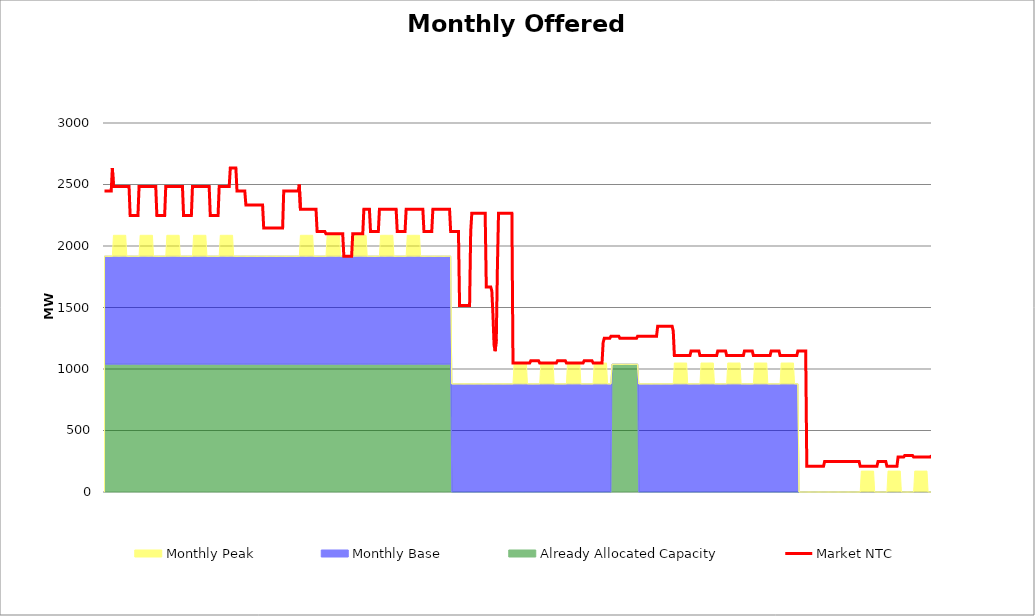
| Category | Market NTC |
|---|---|
| 0 | 2447 |
| 1 | 2447 |
| 2 | 2447 |
| 3 | 2447 |
| 4 | 2447 |
| 5 | 2447 |
| 6 | 2447 |
| 7 | 2634 |
| 8 | 2484 |
| 9 | 2484 |
| 10 | 2484 |
| 11 | 2484 |
| 12 | 2484 |
| 13 | 2484 |
| 14 | 2484 |
| 15 | 2484 |
| 16 | 2484 |
| 17 | 2484 |
| 18 | 2484 |
| 19 | 2484 |
| 20 | 2484 |
| 21 | 2484 |
| 22 | 2484 |
| 23 | 2247 |
| 24 | 2247 |
| 25 | 2247 |
| 26 | 2247 |
| 27 | 2247 |
| 28 | 2247 |
| 29 | 2247 |
| 30 | 2247 |
| 31 | 2484 |
| 32 | 2484 |
| 33 | 2484 |
| 34 | 2484 |
| 35 | 2484 |
| 36 | 2484 |
| 37 | 2484 |
| 38 | 2484 |
| 39 | 2484 |
| 40 | 2484 |
| 41 | 2484 |
| 42 | 2484 |
| 43 | 2484 |
| 44 | 2484 |
| 45 | 2484 |
| 46 | 2484 |
| 47 | 2247 |
| 48 | 2247 |
| 49 | 2247 |
| 50 | 2247 |
| 51 | 2247 |
| 52 | 2247 |
| 53 | 2247 |
| 54 | 2247 |
| 55 | 2484 |
| 56 | 2484 |
| 57 | 2484 |
| 58 | 2484 |
| 59 | 2484 |
| 60 | 2484 |
| 61 | 2484 |
| 62 | 2484 |
| 63 | 2484 |
| 64 | 2484 |
| 65 | 2484 |
| 66 | 2484 |
| 67 | 2484 |
| 68 | 2484 |
| 69 | 2484 |
| 70 | 2484 |
| 71 | 2247 |
| 72 | 2247 |
| 73 | 2247 |
| 74 | 2247 |
| 75 | 2247 |
| 76 | 2247 |
| 77 | 2247 |
| 78 | 2247 |
| 79 | 2484 |
| 80 | 2484 |
| 81 | 2484 |
| 82 | 2484 |
| 83 | 2484 |
| 84 | 2484 |
| 85 | 2484 |
| 86 | 2484 |
| 87 | 2484 |
| 88 | 2484 |
| 89 | 2484 |
| 90 | 2484 |
| 91 | 2484 |
| 92 | 2484 |
| 93 | 2484 |
| 94 | 2484 |
| 95 | 2247 |
| 96 | 2247 |
| 97 | 2247 |
| 98 | 2247 |
| 99 | 2247 |
| 100 | 2247 |
| 101 | 2247 |
| 102 | 2247 |
| 103 | 2484 |
| 104 | 2484 |
| 105 | 2484 |
| 106 | 2484 |
| 107 | 2484 |
| 108 | 2484 |
| 109 | 2484 |
| 110 | 2484 |
| 111 | 2484 |
| 112 | 2484 |
| 113 | 2634 |
| 114 | 2634 |
| 115 | 2634 |
| 116 | 2634 |
| 117 | 2634 |
| 118 | 2634 |
| 119 | 2447 |
| 120 | 2447 |
| 121 | 2447 |
| 122 | 2447 |
| 123 | 2447 |
| 124 | 2447 |
| 125 | 2447 |
| 126 | 2447 |
| 127 | 2334 |
| 128 | 2334 |
| 129 | 2334 |
| 130 | 2334 |
| 131 | 2334 |
| 132 | 2334 |
| 133 | 2334 |
| 134 | 2334 |
| 135 | 2334 |
| 136 | 2334 |
| 137 | 2334 |
| 138 | 2334 |
| 139 | 2334 |
| 140 | 2334 |
| 141 | 2334 |
| 142 | 2334 |
| 143 | 2147 |
| 144 | 2147 |
| 145 | 2147 |
| 146 | 2147 |
| 147 | 2147 |
| 148 | 2147 |
| 149 | 2147 |
| 150 | 2147 |
| 151 | 2147 |
| 152 | 2147 |
| 153 | 2147 |
| 154 | 2147 |
| 155 | 2147 |
| 156 | 2147 |
| 157 | 2147 |
| 158 | 2147 |
| 159 | 2147 |
| 160 | 2147 |
| 161 | 2447 |
| 162 | 2447 |
| 163 | 2447 |
| 164 | 2447 |
| 165 | 2447 |
| 166 | 2447 |
| 167 | 2447 |
| 168 | 2447 |
| 169 | 2447 |
| 170 | 2447 |
| 171 | 2447 |
| 172 | 2447 |
| 173 | 2447 |
| 174 | 2447 |
| 175 | 2499 |
| 176 | 2299 |
| 177 | 2299 |
| 178 | 2299 |
| 179 | 2299 |
| 180 | 2299 |
| 181 | 2299 |
| 182 | 2299 |
| 183 | 2299 |
| 184 | 2299 |
| 185 | 2299 |
| 186 | 2299 |
| 187 | 2299 |
| 188 | 2299 |
| 189 | 2299 |
| 190 | 2299 |
| 191 | 2117 |
| 192 | 2117 |
| 193 | 2117 |
| 194 | 2117 |
| 195 | 2117 |
| 196 | 2117 |
| 197 | 2117 |
| 198 | 2117 |
| 199 | 2099 |
| 200 | 2099 |
| 201 | 2099 |
| 202 | 2099 |
| 203 | 2099 |
| 204 | 2099 |
| 205 | 2099 |
| 206 | 2099 |
| 207 | 2099 |
| 208 | 2099 |
| 209 | 2099 |
| 210 | 2099 |
| 211 | 2099 |
| 212 | 2099 |
| 213 | 2099 |
| 214 | 2099 |
| 215 | 1917 |
| 216 | 1917 |
| 217 | 1917 |
| 218 | 1917 |
| 219 | 1917 |
| 220 | 1917 |
| 221 | 1917 |
| 222 | 1917 |
| 223 | 2099 |
| 224 | 2099 |
| 225 | 2099 |
| 226 | 2099 |
| 227 | 2099 |
| 228 | 2099 |
| 229 | 2099 |
| 230 | 2099 |
| 231 | 2099 |
| 232 | 2099 |
| 233 | 2299 |
| 234 | 2299 |
| 235 | 2299 |
| 236 | 2299 |
| 237 | 2299 |
| 238 | 2299 |
| 239 | 2117 |
| 240 | 2117 |
| 241 | 2117 |
| 242 | 2117 |
| 243 | 2117 |
| 244 | 2117 |
| 245 | 2117 |
| 246 | 2117 |
| 247 | 2299 |
| 248 | 2299 |
| 249 | 2299 |
| 250 | 2299 |
| 251 | 2299 |
| 252 | 2299 |
| 253 | 2299 |
| 254 | 2299 |
| 255 | 2299 |
| 256 | 2299 |
| 257 | 2299 |
| 258 | 2299 |
| 259 | 2299 |
| 260 | 2299 |
| 261 | 2299 |
| 262 | 2299 |
| 263 | 2117 |
| 264 | 2117 |
| 265 | 2117 |
| 266 | 2117 |
| 267 | 2117 |
| 268 | 2117 |
| 269 | 2117 |
| 270 | 2117 |
| 271 | 2299 |
| 272 | 2299 |
| 273 | 2299 |
| 274 | 2299 |
| 275 | 2299 |
| 276 | 2299 |
| 277 | 2299 |
| 278 | 2299 |
| 279 | 2299 |
| 280 | 2299 |
| 281 | 2299 |
| 282 | 2299 |
| 283 | 2299 |
| 284 | 2299 |
| 285 | 2299 |
| 286 | 2299 |
| 287 | 2117 |
| 288 | 2117 |
| 289 | 2117 |
| 290 | 2117 |
| 291 | 2117 |
| 292 | 2117 |
| 293 | 2117 |
| 294 | 2117 |
| 295 | 2299 |
| 296 | 2299 |
| 297 | 2299 |
| 298 | 2299 |
| 299 | 2299 |
| 300 | 2299 |
| 301 | 2299 |
| 302 | 2299 |
| 303 | 2299 |
| 304 | 2299 |
| 305 | 2299 |
| 306 | 2299 |
| 307 | 2299 |
| 308 | 2299 |
| 309 | 2299 |
| 310 | 2299 |
| 311 | 2117 |
| 312 | 2117 |
| 313 | 2117 |
| 314 | 2117 |
| 315 | 2117 |
| 316 | 2117 |
| 317 | 2117 |
| 318 | 2117 |
| 319 | 1517 |
| 320 | 1517 |
| 321 | 1517 |
| 322 | 1517 |
| 323 | 1517 |
| 324 | 1517 |
| 325 | 1517 |
| 326 | 1517 |
| 327 | 1517 |
| 328 | 1517 |
| 329 | 2117 |
| 330 | 2267 |
| 331 | 2267 |
| 332 | 2267 |
| 333 | 2267 |
| 334 | 2267 |
| 335 | 2267 |
| 336 | 2267 |
| 337 | 2267 |
| 338 | 2267 |
| 339 | 2267 |
| 340 | 2267 |
| 341 | 2267 |
| 342 | 2267 |
| 343 | 1667 |
| 344 | 1667 |
| 345 | 1667 |
| 346 | 1667 |
| 347 | 1667 |
| 348 | 1634 |
| 349 | 1438 |
| 350 | 1194 |
| 351 | 1145 |
| 352 | 1243 |
| 353 | 1829 |
| 354 | 2267 |
| 355 | 2267 |
| 356 | 2267 |
| 357 | 2267 |
| 358 | 2267 |
| 359 | 2267 |
| 360 | 2267 |
| 361 | 2267 |
| 362 | 2267 |
| 363 | 2267 |
| 364 | 2267 |
| 365 | 2267 |
| 366 | 2267 |
| 367 | 1049 |
| 368 | 1049 |
| 369 | 1049 |
| 370 | 1049 |
| 371 | 1049 |
| 372 | 1049 |
| 373 | 1049 |
| 374 | 1049 |
| 375 | 1049 |
| 376 | 1049 |
| 377 | 1049 |
| 378 | 1049 |
| 379 | 1049 |
| 380 | 1049 |
| 381 | 1049 |
| 382 | 1049 |
| 383 | 1067 |
| 384 | 1067 |
| 385 | 1067 |
| 386 | 1067 |
| 387 | 1067 |
| 388 | 1067 |
| 389 | 1067 |
| 390 | 1067 |
| 391 | 1049 |
| 392 | 1049 |
| 393 | 1049 |
| 394 | 1049 |
| 395 | 1049 |
| 396 | 1049 |
| 397 | 1049 |
| 398 | 1049 |
| 399 | 1049 |
| 400 | 1049 |
| 401 | 1049 |
| 402 | 1049 |
| 403 | 1049 |
| 404 | 1049 |
| 405 | 1049 |
| 406 | 1049 |
| 407 | 1067 |
| 408 | 1067 |
| 409 | 1067 |
| 410 | 1067 |
| 411 | 1067 |
| 412 | 1067 |
| 413 | 1067 |
| 414 | 1067 |
| 415 | 1049 |
| 416 | 1049 |
| 417 | 1049 |
| 418 | 1049 |
| 419 | 1049 |
| 420 | 1049 |
| 421 | 1049 |
| 422 | 1049 |
| 423 | 1049 |
| 424 | 1049 |
| 425 | 1049 |
| 426 | 1049 |
| 427 | 1049 |
| 428 | 1049 |
| 429 | 1049 |
| 430 | 1049 |
| 431 | 1067 |
| 432 | 1067 |
| 433 | 1067 |
| 434 | 1067 |
| 435 | 1067 |
| 436 | 1067 |
| 437 | 1067 |
| 438 | 1067 |
| 439 | 1049 |
| 440 | 1049 |
| 441 | 1049 |
| 442 | 1049 |
| 443 | 1049 |
| 444 | 1049 |
| 445 | 1049 |
| 446 | 1049 |
| 447 | 1049 |
| 448 | 1215 |
| 449 | 1249 |
| 450 | 1249 |
| 451 | 1249 |
| 452 | 1249 |
| 453 | 1249 |
| 454 | 1249 |
| 455 | 1267 |
| 456 | 1267 |
| 457 | 1267 |
| 458 | 1267 |
| 459 | 1267 |
| 460 | 1267 |
| 461 | 1267 |
| 462 | 1267 |
| 463 | 1249 |
| 464 | 1249 |
| 465 | 1249 |
| 466 | 1249 |
| 467 | 1249 |
| 468 | 1249 |
| 469 | 1249 |
| 470 | 1249 |
| 471 | 1249 |
| 472 | 1249 |
| 473 | 1249 |
| 474 | 1249 |
| 475 | 1249 |
| 476 | 1249 |
| 477 | 1249 |
| 478 | 1249 |
| 479 | 1267 |
| 480 | 1267 |
| 481 | 1267 |
| 482 | 1267 |
| 483 | 1267 |
| 484 | 1267 |
| 485 | 1267 |
| 486 | 1267 |
| 487 | 1267 |
| 488 | 1267 |
| 489 | 1267 |
| 490 | 1267 |
| 491 | 1267 |
| 492 | 1267 |
| 493 | 1267 |
| 494 | 1267 |
| 495 | 1267 |
| 496 | 1267 |
| 497 | 1347 |
| 498 | 1347 |
| 499 | 1347 |
| 500 | 1347 |
| 501 | 1347 |
| 502 | 1347 |
| 503 | 1347 |
| 504 | 1347 |
| 505 | 1347 |
| 506 | 1347 |
| 507 | 1347 |
| 508 | 1347 |
| 509 | 1347 |
| 510 | 1347 |
| 511 | 1309 |
| 512 | 1109 |
| 513 | 1109 |
| 514 | 1109 |
| 515 | 1109 |
| 516 | 1109 |
| 517 | 1109 |
| 518 | 1109 |
| 519 | 1109 |
| 520 | 1109 |
| 521 | 1109 |
| 522 | 1109 |
| 523 | 1109 |
| 524 | 1109 |
| 525 | 1109 |
| 526 | 1109 |
| 527 | 1147 |
| 528 | 1147 |
| 529 | 1147 |
| 530 | 1147 |
| 531 | 1147 |
| 532 | 1147 |
| 533 | 1147 |
| 534 | 1147 |
| 535 | 1109 |
| 536 | 1109 |
| 537 | 1109 |
| 538 | 1109 |
| 539 | 1109 |
| 540 | 1109 |
| 541 | 1109 |
| 542 | 1109 |
| 543 | 1109 |
| 544 | 1109 |
| 545 | 1109 |
| 546 | 1109 |
| 547 | 1109 |
| 548 | 1109 |
| 549 | 1109 |
| 550 | 1109 |
| 551 | 1147 |
| 552 | 1147 |
| 553 | 1147 |
| 554 | 1147 |
| 555 | 1147 |
| 556 | 1147 |
| 557 | 1147 |
| 558 | 1147 |
| 559 | 1109 |
| 560 | 1109 |
| 561 | 1109 |
| 562 | 1109 |
| 563 | 1109 |
| 564 | 1109 |
| 565 | 1109 |
| 566 | 1109 |
| 567 | 1109 |
| 568 | 1109 |
| 569 | 1109 |
| 570 | 1109 |
| 571 | 1109 |
| 572 | 1109 |
| 573 | 1109 |
| 574 | 1109 |
| 575 | 1147 |
| 576 | 1147 |
| 577 | 1147 |
| 578 | 1147 |
| 579 | 1147 |
| 580 | 1147 |
| 581 | 1147 |
| 582 | 1147 |
| 583 | 1109 |
| 584 | 1109 |
| 585 | 1109 |
| 586 | 1109 |
| 587 | 1109 |
| 588 | 1109 |
| 589 | 1109 |
| 590 | 1109 |
| 591 | 1109 |
| 592 | 1109 |
| 593 | 1109 |
| 594 | 1109 |
| 595 | 1109 |
| 596 | 1109 |
| 597 | 1109 |
| 598 | 1109 |
| 599 | 1147 |
| 600 | 1147 |
| 601 | 1147 |
| 602 | 1147 |
| 603 | 1147 |
| 604 | 1147 |
| 605 | 1147 |
| 606 | 1147 |
| 607 | 1109 |
| 608 | 1109 |
| 609 | 1109 |
| 610 | 1109 |
| 611 | 1109 |
| 612 | 1109 |
| 613 | 1109 |
| 614 | 1109 |
| 615 | 1109 |
| 616 | 1109 |
| 617 | 1109 |
| 618 | 1109 |
| 619 | 1109 |
| 620 | 1109 |
| 621 | 1109 |
| 622 | 1109 |
| 623 | 1147 |
| 624 | 1147 |
| 625 | 1147 |
| 626 | 1147 |
| 627 | 1147 |
| 628 | 1147 |
| 629 | 1147 |
| 630 | 1147 |
| 631 | 209 |
| 632 | 209 |
| 633 | 209 |
| 634 | 209 |
| 635 | 209 |
| 636 | 209 |
| 637 | 209 |
| 638 | 209 |
| 639 | 209 |
| 640 | 209 |
| 641 | 209 |
| 642 | 209 |
| 643 | 209 |
| 644 | 209 |
| 645 | 209 |
| 646 | 209 |
| 647 | 247 |
| 648 | 247 |
| 649 | 247 |
| 650 | 247 |
| 651 | 247 |
| 652 | 247 |
| 653 | 247 |
| 654 | 247 |
| 655 | 247 |
| 656 | 247 |
| 657 | 247 |
| 658 | 247 |
| 659 | 247 |
| 660 | 247 |
| 661 | 247 |
| 662 | 247 |
| 663 | 247 |
| 664 | 247 |
| 665 | 247 |
| 666 | 247 |
| 667 | 247 |
| 668 | 247 |
| 669 | 247 |
| 670 | 247 |
| 671 | 247 |
| 672 | 247 |
| 673 | 247 |
| 674 | 247 |
| 675 | 247 |
| 676 | 247 |
| 677 | 247 |
| 678 | 247 |
| 679 | 209 |
| 680 | 209 |
| 681 | 209 |
| 682 | 209 |
| 683 | 209 |
| 684 | 209 |
| 685 | 209 |
| 686 | 209 |
| 687 | 209 |
| 688 | 209 |
| 689 | 209 |
| 690 | 209 |
| 691 | 209 |
| 692 | 209 |
| 693 | 209 |
| 694 | 209 |
| 695 | 247 |
| 696 | 247 |
| 697 | 247 |
| 698 | 247 |
| 699 | 247 |
| 700 | 247 |
| 701 | 247 |
| 702 | 247 |
| 703 | 209 |
| 704 | 209 |
| 705 | 209 |
| 706 | 209 |
| 707 | 209 |
| 708 | 209 |
| 709 | 209 |
| 710 | 209 |
| 711 | 209 |
| 712 | 209 |
| 713 | 284 |
| 714 | 284 |
| 715 | 284 |
| 716 | 284 |
| 717 | 284 |
| 718 | 284 |
| 719 | 297 |
| 720 | 297 |
| 721 | 297 |
| 722 | 297 |
| 723 | 297 |
| 724 | 297 |
| 725 | 297 |
| 726 | 297 |
| 727 | 284 |
| 728 | 284 |
| 729 | 284 |
| 730 | 284 |
| 731 | 284 |
| 732 | 284 |
| 733 | 284 |
| 734 | 284 |
| 735 | 284 |
| 736 | 284 |
| 737 | 284 |
| 738 | 284 |
| 739 | 284 |
| 740 | 284 |
| 741 | 284 |
| 742 | 284 |
| 743 | 297 |